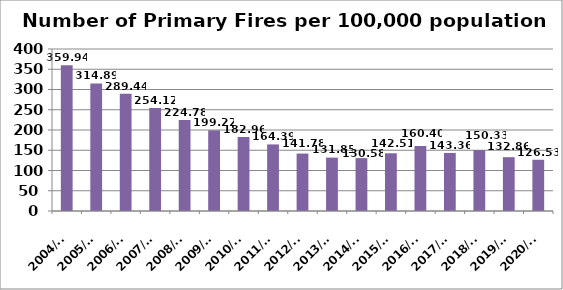
| Category | Series 0 |
|---|---|
| 2004/05 | 359.94 |
| 2005/06 | 314.89 |
| 2006/07 | 289.44 |
| 2007/08 | 254.12 |
| 2008/09 | 224.78 |
| 2009/10 | 199.22 |
| 2010/11 | 182.96 |
| 2011/12 | 164.39 |
| 2012/13 | 141.78 |
| 2013/14 | 131.85 |
| 2014/15 | 130.58 |
| 2015/16 | 142.51 |
| 2016/17 | 160.4 |
| 2017/18 | 143.36 |
| 2018/19 | 150.33 |
| 2019/20 | 132.86 |
| 2020/21 | 126.53 |